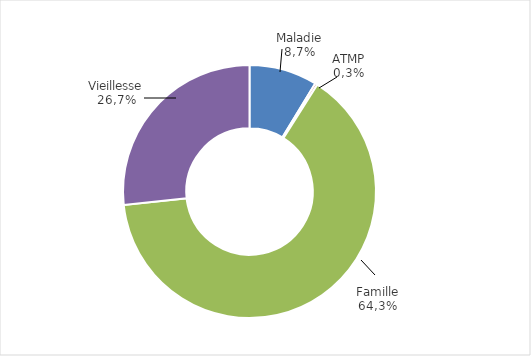
| Category | Series 0 |
|---|---|
| Maladie | 0.087 |
| ATMP | 0.003 |
| Famille | 0.643 |
| Vieillesse  | 0.267 |